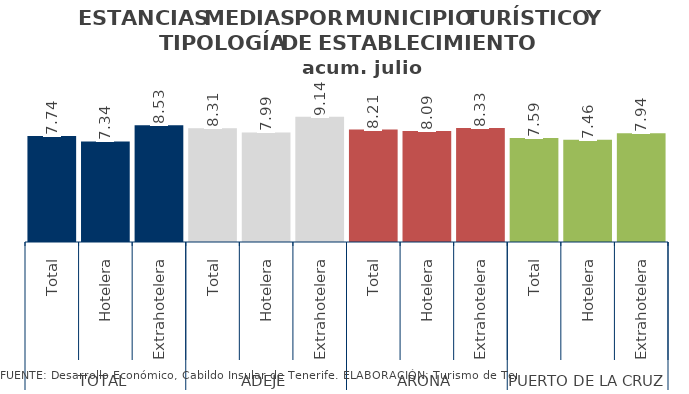
| Category | Series 2 |
|---|---|
| 0 | 7.742 |
| 1 | 7.338 |
| 2 | 8.528 |
| 3 | 8.308 |
| 4 | 7.994 |
| 5 | 9.143 |
| 6 | 8.211 |
| 7 | 8.095 |
| 8 | 8.33 |
| 9 | 7.587 |
| 10 | 7.458 |
| 11 | 7.938 |